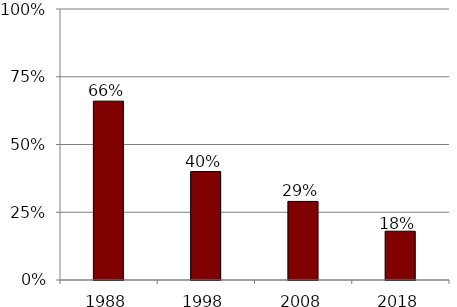
| Category | Series 0 |
|---|---|
| 1988.0 | 0.66 |
| 1998.0 | 0.4 |
| 2008.0 | 0.29 |
| 2018.0 | 0.18 |